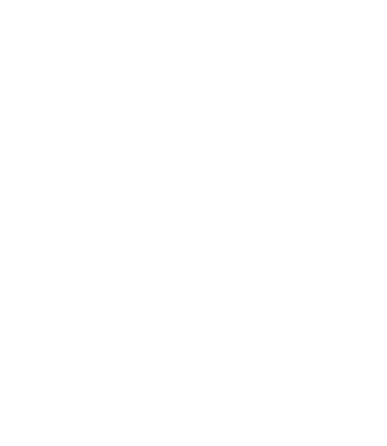
| Category | Series 0 |
|---|---|
| 0 | 0 |
| 1 | 0 |